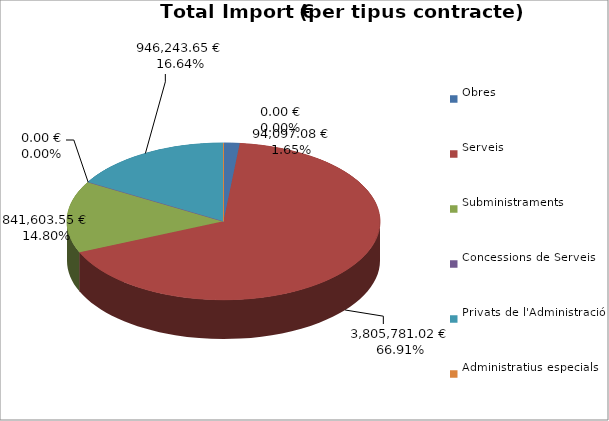
| Category | Total preu
(amb IVA) |
|---|---|
| Obres | 94097.08 |
| Serveis | 3805781.023 |
| Subministraments | 841603.55 |
| Concessions de Serveis | 0 |
| Privats de l'Administració | 946243.65 |
| Administratius especials | 0 |